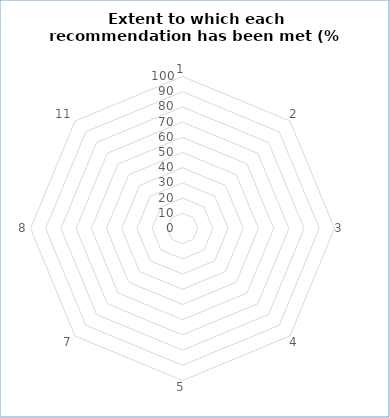
| Category | 1 |
|---|---|
| 1.0 | 0 |
| 2.0 | 0 |
| 3.0 | 0 |
| 4.0 | 0 |
| 5.0 | 0 |
| 7.0 | 0 |
| 8.0 | 0 |
| 11.0 | 0 |